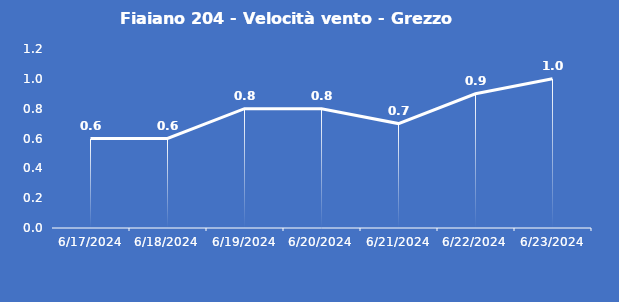
| Category | Fiaiano 204 - Velocità vento - Grezzo (m/s) |
|---|---|
| 6/17/24 | 0.6 |
| 6/18/24 | 0.6 |
| 6/19/24 | 0.8 |
| 6/20/24 | 0.8 |
| 6/21/24 | 0.7 |
| 6/22/24 | 0.9 |
| 6/23/24 | 1 |